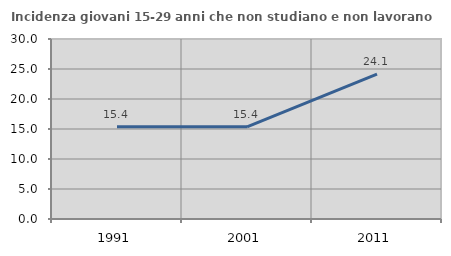
| Category | Incidenza giovani 15-29 anni che non studiano e non lavorano  |
|---|---|
| 1991.0 | 15.385 |
| 2001.0 | 15.356 |
| 2011.0 | 24.138 |